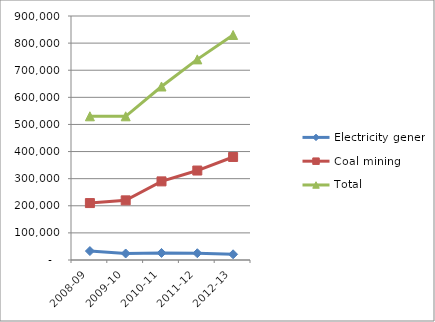
| Category | Electricity generation | Coal mining | Total |
|---|---|---|---|
| 2008-09 | 33000 | 210000 | 530000 |
| 2009-10 | 24000 | 220000 | 530000 |
| 2010-11 | 26000 | 290000 | 640000 |
| 2011-12 | 25000 | 330000 | 740000 |
| 2012-13 | 21000 | 380000 | 830000 |